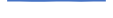
| Category | Series 0 |
|---|---|
| 0 | 403 |
| 1 | 359 |
| 2 | 320 |
| 3 | 337 |
| 4 | 347 |
| 5 | 361 |
| 6 | 316 |
| 7 | 355 |
| 8 | 353 |